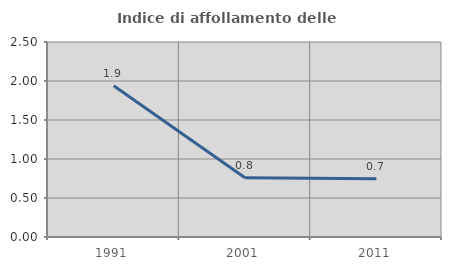
| Category | Indice di affollamento delle abitazioni  |
|---|---|
| 1991.0 | 1.94 |
| 2001.0 | 0.759 |
| 2011.0 | 0.745 |